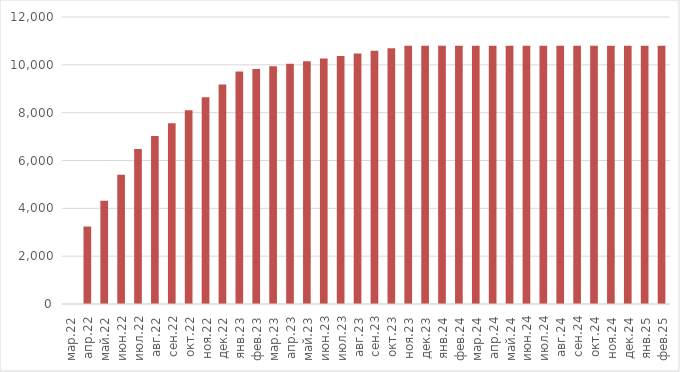
| Category | Выручка |
|---|---|
| мар.22 | 0 |
| апр.22 | 3240 |
| май.22 | 4320 |
| июн.22 | 5400 |
| июл.22 | 6480 |
| авг.22 | 7020 |
| сен.22 | 7560 |
| окт.22 | 8100 |
| ноя.22 | 8640 |
| дек.22 | 9180 |
| янв.23 | 9720 |
| фев.23 | 9828 |
| мар.23 | 9936 |
| апр.23 | 10044 |
| май.23 | 10152 |
| июн.23 | 10260 |
| июл.23 | 10368 |
| авг.23 | 10476 |
| сен.23 | 10584 |
| окт.23 | 10692 |
| ноя.23 | 10800 |
| дек.23 | 10800 |
| янв.24 | 10800 |
| фев.24 | 10800 |
| мар.24 | 10800 |
| апр.24 | 10800 |
| май.24 | 10800 |
| июн.24 | 10800 |
| июл.24 | 10800 |
| авг.24 | 10800 |
| сен.24 | 10800 |
| окт.24 | 10800 |
| ноя.24 | 10800 |
| дек.24 | 10800 |
| янв.25 | 10800 |
| фев.25 | 10800 |